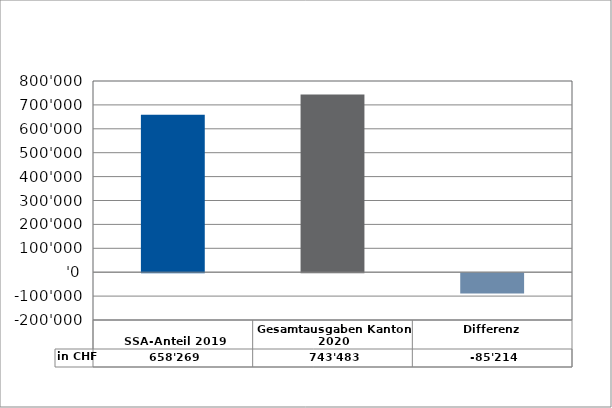
| Category | in CHF |
|---|---|
| 
SSA-Anteil 2019

 | 658269 |
| Gesamtausgaben Kanton 2020
 | 743483.4 |
| Differenz | -85214.4 |